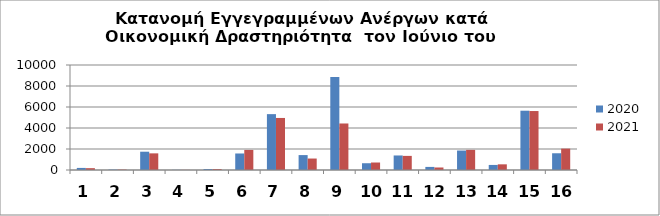
| Category | 2020 | 2021 |
|---|---|---|
| 0 | 198 | 175 |
| 1 | 41 | 42 |
| 2 | 1742 | 1585 |
| 3 | 15 | 12 |
| 4 | 96 | 90 |
| 5 | 1573 | 1911 |
| 6 | 5321 | 4956 |
| 7 | 1420 | 1092 |
| 8 | 8852 | 4430 |
| 9 | 645 | 713 |
| 10 | 1384 | 1344 |
| 11 | 294 | 239 |
| 12 | 1854 | 1915 |
| 13 | 482 | 540 |
| 14 | 5647 | 5616 |
| 15 | 1594 | 2034 |